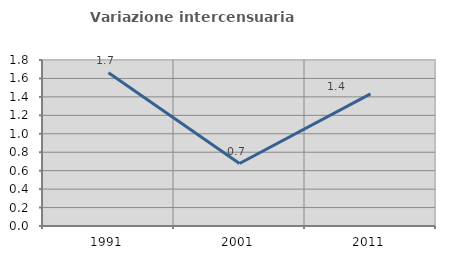
| Category | Variazione intercensuaria annua |
|---|---|
| 1991.0 | 1.663 |
| 2001.0 | 0.677 |
| 2011.0 | 1.432 |